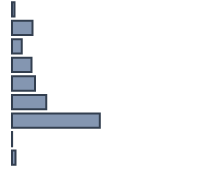
| Category | Series 0 |
|---|---|
| 0 | 1.288 |
| 1 | 10.22 |
| 2 | 4.863 |
| 3 | 9.71 |
| 4 | 11.4 |
| 5 | 17.043 |
| 6 | 43.683 |
| 7 | 0.051 |
| 8 | 1.743 |